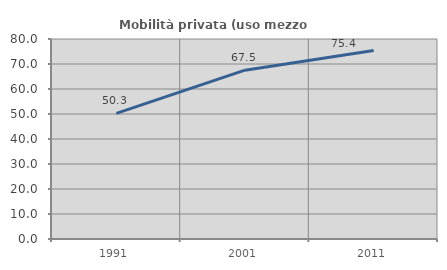
| Category | Mobilità privata (uso mezzo privato) |
|---|---|
| 1991.0 | 50.253 |
| 2001.0 | 67.523 |
| 2011.0 | 75.435 |